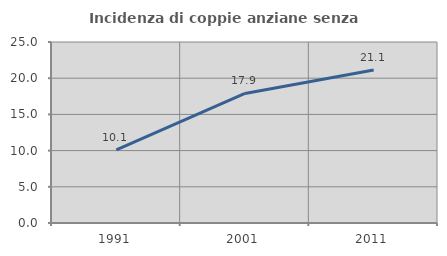
| Category | Incidenza di coppie anziane senza figli  |
|---|---|
| 1991.0 | 10.104 |
| 2001.0 | 17.891 |
| 2011.0 | 21.132 |